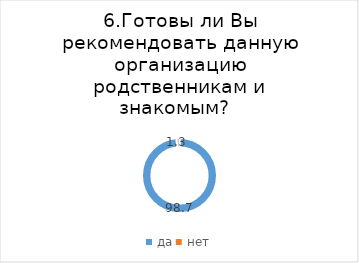
| Category | Series 0 |
|---|---|
| да | 98.746 |
| нет | 1.254 |